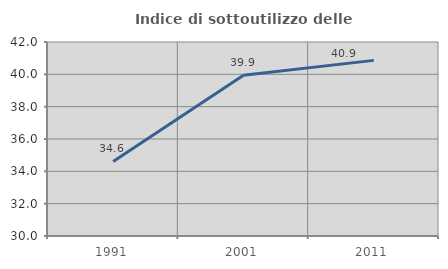
| Category | Indice di sottoutilizzo delle abitazioni  |
|---|---|
| 1991.0 | 34.615 |
| 2001.0 | 39.938 |
| 2011.0 | 40.863 |